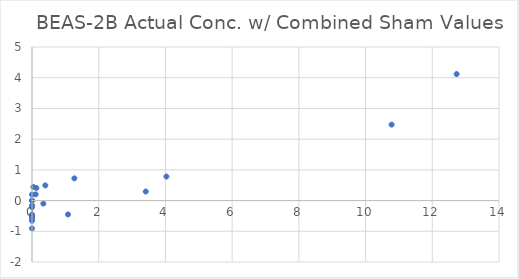
| Category | From Sham  |
|---|---|
| 12.73 | 4.118 |
| 4.03 | 0.782 |
| 1.27 | 0.723 |
| 0.4 | 0.494 |
| 0.13 | 0.41 |
| 0.04 | 0.443 |
| 0.0 | 0 |
| 0.0 | -0.659 |
| 10.78 | 2.473 |
| 3.41 | 0.295 |
| 1.08 | -0.452 |
| 0.34 | -0.099 |
| 0.11 | 0.202 |